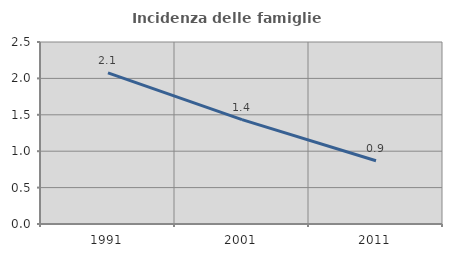
| Category | Incidenza delle famiglie numerose |
|---|---|
| 1991.0 | 2.076 |
| 2001.0 | 1.434 |
| 2011.0 | 0.868 |